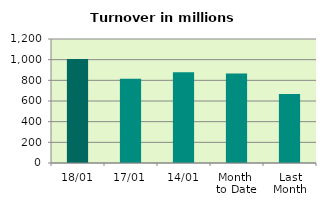
| Category | Series 0 |
|---|---|
| 18/01 | 1007.141 |
| 17/01 | 815.844 |
| 14/01 | 877.759 |
| Month 
to Date | 867.251 |
| Last
Month | 667.375 |